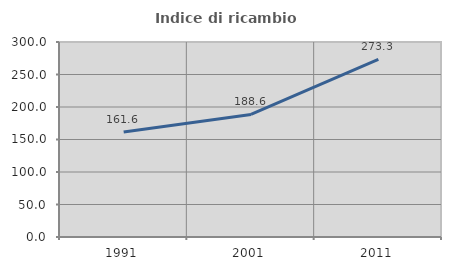
| Category | Indice di ricambio occupazionale  |
|---|---|
| 1991.0 | 161.631 |
| 2001.0 | 188.561 |
| 2011.0 | 273.333 |